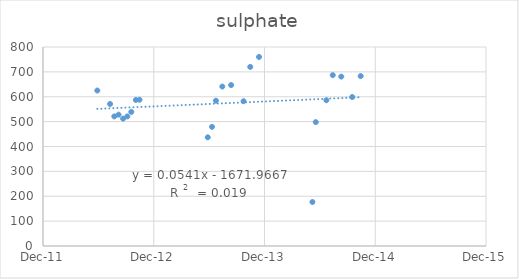
| Category | Series 0 |
|---|---|
| 41059.0 | 625 |
| 41101.0 | 571 |
| 41115.0 | 521 |
| 41129.0 | 528 |
| 41144.0 | 512 |
| 41158.0 | 521 |
| 41171.0 | 539 |
| 41186.0 | 587 |
| 41198.0 | 588 |
| 41423.0 | 437 |
| 41437.0 | 479 |
| 41450.0 | 584 |
| 41471.0 | 641 |
| 41500.0 | 647 |
| 41541.0 | 582 |
| 41563.0 | 720 |
| 41592.0 | 760 |
| 41768.0 | 177 |
| 41779.0 | 498 |
| 41814.0 | 586 |
| 41835.0 | 687 |
| 41863.0 | 681 |
| 41899.0 | 599 |
| 41927.0 | 683 |